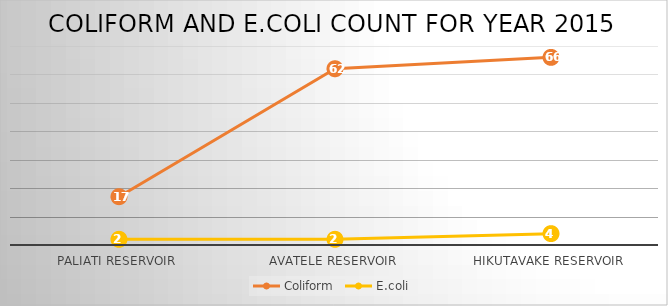
| Category | Coliform | E.coli |
|---|---|---|
| Paliati Reservoir | 17 | 2 |
| Avatele Reservoir | 62 | 2 |
| Hikutavake Reservoir | 66 | 4 |